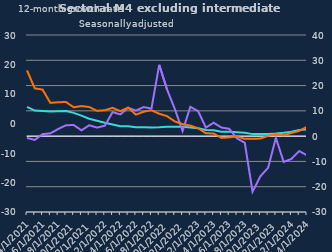
| Category | zero | Households | Non-intermediate OFCs |
|---|---|---|---|
| Apr-2021 | 0 | 11.6 | -0.7 |
| May-2021 | 0 | 10.1 | -1.5 |
| Jun-2021 | 0 | 9.9 | 0.8 |
| Jul-2021 | 0 | 9.7 | 1.1 |
| Aug-2021 | 0 | 9.8 | 2.8 |
| Sep-2021 | 0 | 9.9 | 4.3 |
| Oct-2021 | 0 | 9.2 | 4.4 |
| Nov-2021 | 0 | 8.1 | 2.3 |
| Dec-2021 | 0 | 6.9 | 4.3 |
| Jan-2022 | 0 | 6.1 | 3.4 |
| Feb-2022 | 0 | 5.3 | 4.1 |
| Mar-2022 | 0 | 4.6 | 9.5 |
| Apr-2022 | 0 | 3.9 | 8.6 |
| May-2022 | 0 | 3.9 | 11.2 |
| Jun-2022 | 0 | 3.5 | 10.1 |
| Jul-2022 | 0 | 3.5 | 11.5 |
| Aug-2022 | 0 | 3.4 | 10.9 |
| Sep-2022 | 0 | 3.5 | 28.2 |
| Oct-2022 | 0 | 3.7 | 18.5 |
| Nov-2022 | 0 | 3.7 | 10.8 |
| Dec-2022 | 0 | 3.7 | 2 |
| Jan-2023 | 0 | 3.4 | 11.6 |
| Feb-2023 | 0 | 3.1 | 9.9 |
| Mar-2023 | 0 | 2.4 | 3.4 |
| Apr-2023 | 0 | 2.3 | 5.3 |
| May-2023 | 0 | 1.7 | 3.4 |
| Jun-2023 | 0 | 1.7 | 2.9 |
| Jul-2023 | 0 | 1.5 | -0.9 |
| Aug-2023 | 0 | 1.3 | -2.6 |
| Sep-2023 | 0 | 0.8 | -22 |
| Oct-2023 | 0 | 0.8 | -15.9 |
| Nov-2023 | 0 | 0.8 | -12.5 |
| Dec-2023 | 0 | 1 | -0.7 |
| Jan-2024 | 0 | 1.3 | -10.2 |
| Feb-2024 | 0 | 1.7 | -9 |
| Mar-2024 | 0 | 2.4 | -5.9 |
| Apr-2024 | 0 | 2.7 | -7.6 |